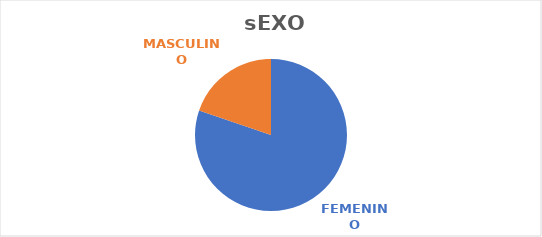
| Category | Series 0 |
|---|---|
| FEMENINO | 65 |
| MASCULINO | 16 |